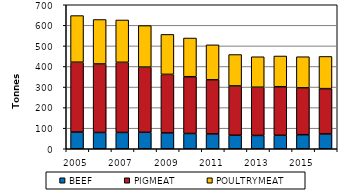
| Category | BEEF | PIGMEAT | POULTRYMEAT |
|---|---|---|---|
| 2005.0 | 81031 | 339635 | 226762 |
| 2006.0 | 79187 | 333015 | 216111 |
| 2007.0 | 79328 | 340863 | 205826 |
| 2008.0 | 80020 | 316985 | 201693 |
| 2009.0 | 77026 | 284572 | 194252 |
| 2010.0 | 74259 | 275905 | 188177 |
| 2011.0 | 72124.85 | 262944.118 | 170084.185 |
| 2012.0 | 65713 | 239753 | 152613 |
| 2013.0 | 64825 | 234273 | 148174 |
| 2014.0 | 65529 | 235991 | 149410 |
| 2015.0 | 68286 | 227739 | 151406 |
| 2016.0 | 71933 | 220334 | 156492 |